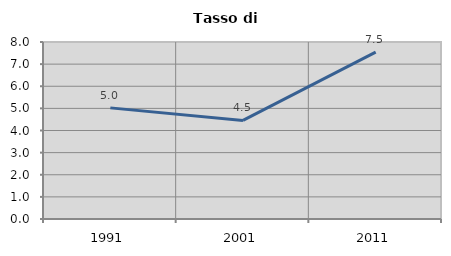
| Category | Tasso di disoccupazione   |
|---|---|
| 1991.0 | 5.023 |
| 2001.0 | 4.457 |
| 2011.0 | 7.545 |